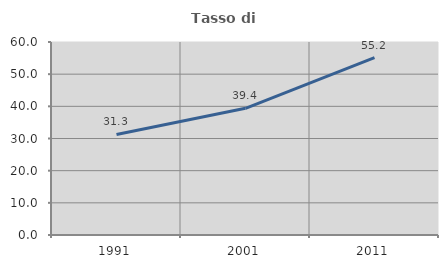
| Category | Tasso di occupazione   |
|---|---|
| 1991.0 | 31.25 |
| 2001.0 | 39.394 |
| 2011.0 | 55.172 |